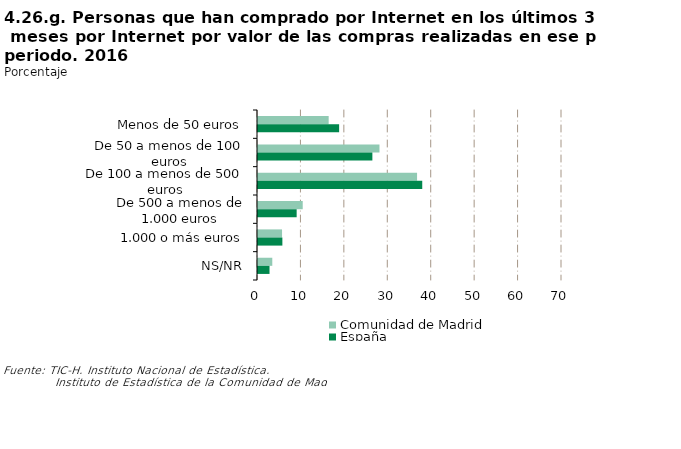
| Category | Comunidad de Madrid | España |
|---|---|---|
| Menos de 50 euros | 16.273 | 18.68 |
| De 50 a menos de 100 euros | 27.974 | 26.336 |
| De 100 a menos de 500 euros | 36.626 | 37.819 |
| De 500 a menos de 1.000 euros | 10.299 | 8.9 |
| 1.000 o más euros | 5.538 | 5.612 |
| NS/NR | 3.29 | 2.652 |